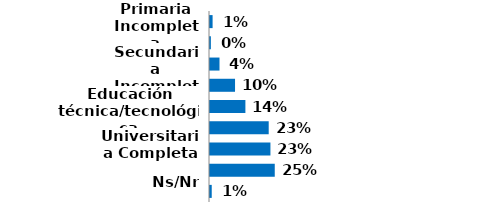
| Category | Series 0 |
|---|---|
| Primaria Incompleta | 0.01 |
| Primaria Completa | 0.003 |
| Secundaria Incompleta | 0.037 |
| Secundaria Completa | 0.097 |
| Educación técnica/tecnológica | 0.137 |
| Universitaria Incompleta | 0.227 |
| Universitaria Completa | 0.233 |
| Postgrado | 0.25 |
| Ns/Nr | 0.007 |